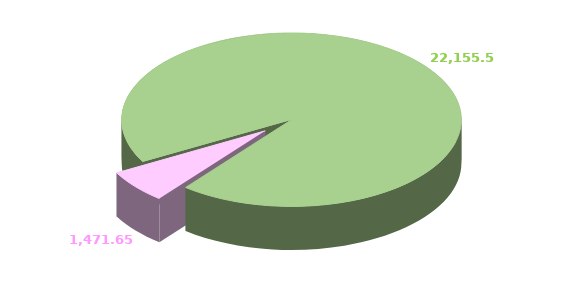
| Category | Series 0 |
|---|---|
| 0 | 22155.554 |
| 1 | 1471.647 |